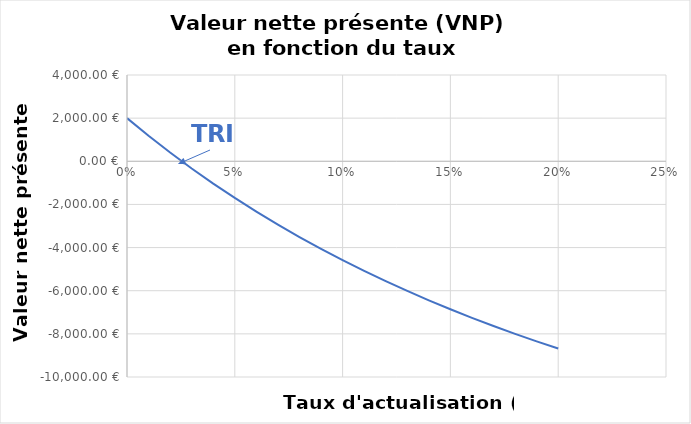
| Category | VNP |
|---|---|
| 0.0 | 2000 |
| 0.01 | 1181.729 |
| 0.02 | 405.101 |
| 0.03 | -332.458 |
| 0.04 | -1033.337 |
| 0.05 | -1699.757 |
| 0.06 | -2333.781 |
| 0.07 | -2937.33 |
| 0.08 | -3512.19 |
| 0.09 | -4060.029 |
| 0.1 | -4582.399 |
| 0.11 | -5080.751 |
| 0.12 | -5556.436 |
| 0.13 | -6010.72 |
| 0.14 | -6444.785 |
| 0.15 | -6859.737 |
| 0.16 | -7256.611 |
| 0.17 | -7636.377 |
| 0.18 | -7999.945 |
| 0.19 | -8348.166 |
| 0.2 | -8681.842 |